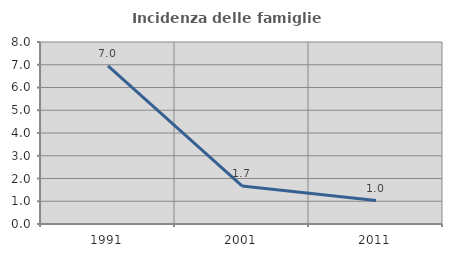
| Category | Incidenza delle famiglie numerose |
|---|---|
| 1991.0 | 6.954 |
| 2001.0 | 1.672 |
| 2011.0 | 1.031 |